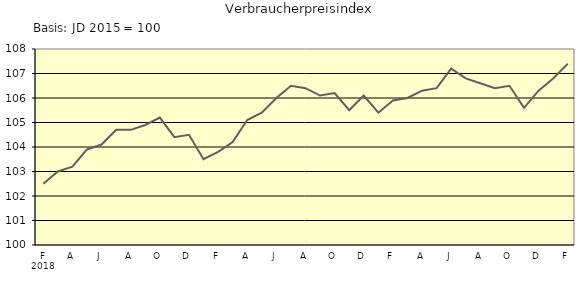
| Category | Series 0 |
|---|---|
| 0 | 102.5 |
| 1 | 103 |
| 2 | 103.2 |
| 3 | 103.9 |
| 4 | 104.1 |
| 5 | 104.7 |
| 6 | 104.7 |
| 7 | 104.9 |
| 8 | 105.2 |
| 9 | 104.4 |
| 10 | 104.5 |
| 11 | 103.5 |
| 12 | 103.8 |
| 13 | 104.2 |
| 14 | 105.1 |
| 15 | 105.4 |
| 16 | 106 |
| 17 | 106.5 |
| 18 | 106.4 |
| 19 | 106.1 |
| 20 | 106.2 |
| 21 | 105.5 |
| 22 | 106.1 |
| 23 | 105.4 |
| 24 | 105.9 |
| 25 | 106 |
| 26 | 106.3 |
| 27 | 106.4 |
| 28 | 107.2 |
| 29 | 106.8 |
| 30 | 106.6 |
| 31 | 106.4 |
| 32 | 106.5 |
| 33 | 105.6 |
| 34 | 106.3 |
| 35 | 106.8 |
| 36 | 107.4 |